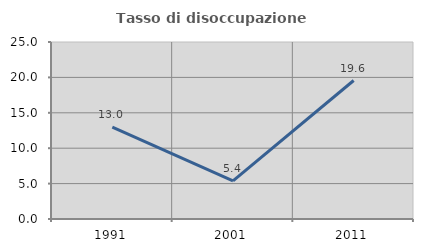
| Category | Tasso di disoccupazione giovanile  |
|---|---|
| 1991.0 | 12.977 |
| 2001.0 | 5.374 |
| 2011.0 | 19.559 |